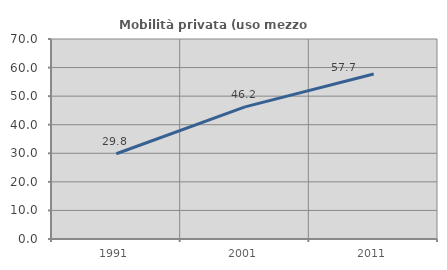
| Category | Mobilità privata (uso mezzo privato) |
|---|---|
| 1991.0 | 29.841 |
| 2001.0 | 46.24 |
| 2011.0 | 57.739 |